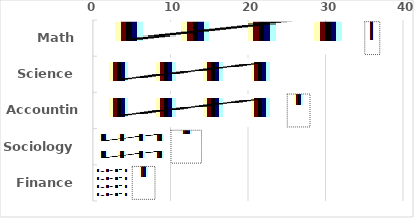
| Category | 5 Mark | 1 Mark |
|---|---|---|
| Math | 35 | 2 |
| Science | 25 | 0 |
| Accounting | 25 | 3 |
| Sociology | 10 | 4 |
| Finance | 5 | 3 |